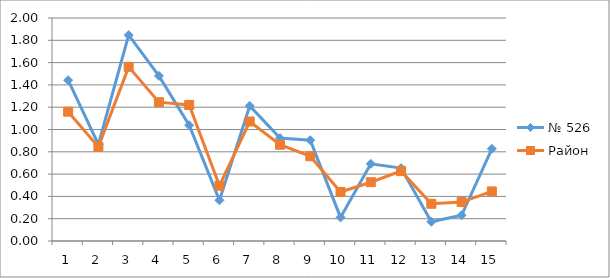
| Category | № 526 | Район |
|---|---|---|
| 0 | 1.442 | 1.16 |
| 1 | 0.865 | 0.844 |
| 2 | 1.846 | 1.562 |
| 3 | 1.481 | 1.245 |
| 4 | 1.038 | 1.22 |
| 5 | 0.365 | 0.496 |
| 6 | 1.212 | 1.072 |
| 7 | 0.923 | 0.863 |
| 8 | 0.904 | 0.76 |
| 9 | 0.212 | 0.44 |
| 10 | 0.692 | 0.527 |
| 11 | 0.654 | 0.627 |
| 12 | 0.173 | 0.334 |
| 13 | 0.231 | 0.349 |
| 14 | 0.827 | 0.445 |